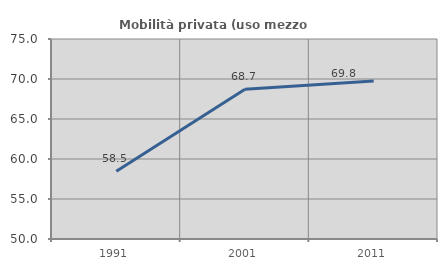
| Category | Mobilità privata (uso mezzo privato) |
|---|---|
| 1991.0 | 58.464 |
| 2001.0 | 68.728 |
| 2011.0 | 69.759 |